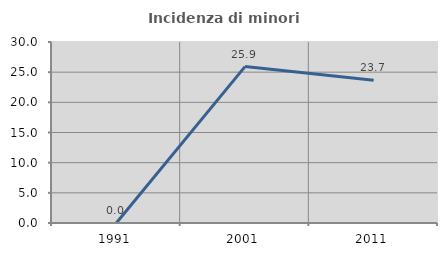
| Category | Incidenza di minori stranieri |
|---|---|
| 1991.0 | 0 |
| 2001.0 | 25.926 |
| 2011.0 | 23.656 |